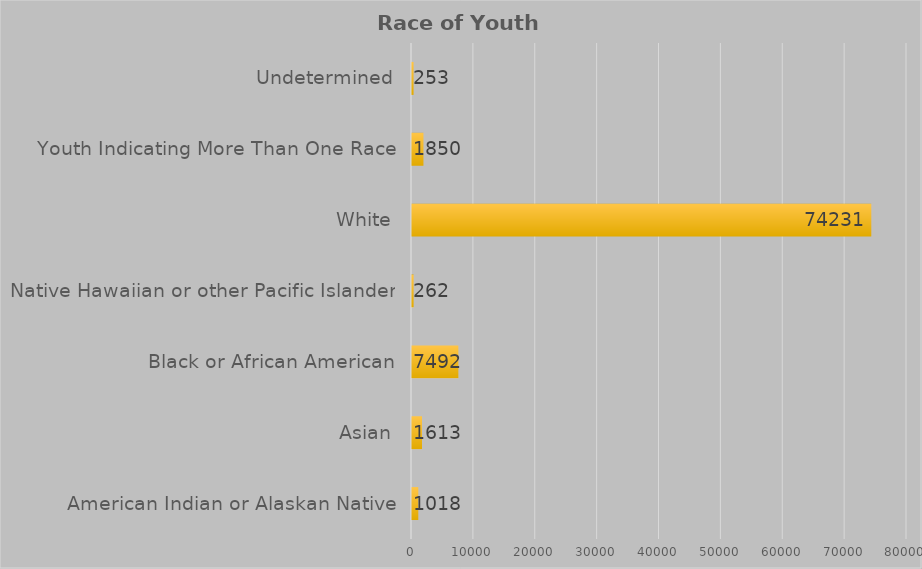
| Category | TOTAL YOUTH |
|---|---|
| American Indian or Alaskan Native | 1018 |
| Asian | 1613 |
| Black or African American | 7492 |
| Native Hawaiian or other Pacific Islander | 262 |
| White | 74231 |
| Youth Indicating More Than One Race | 1850 |
| Undetermined | 253 |